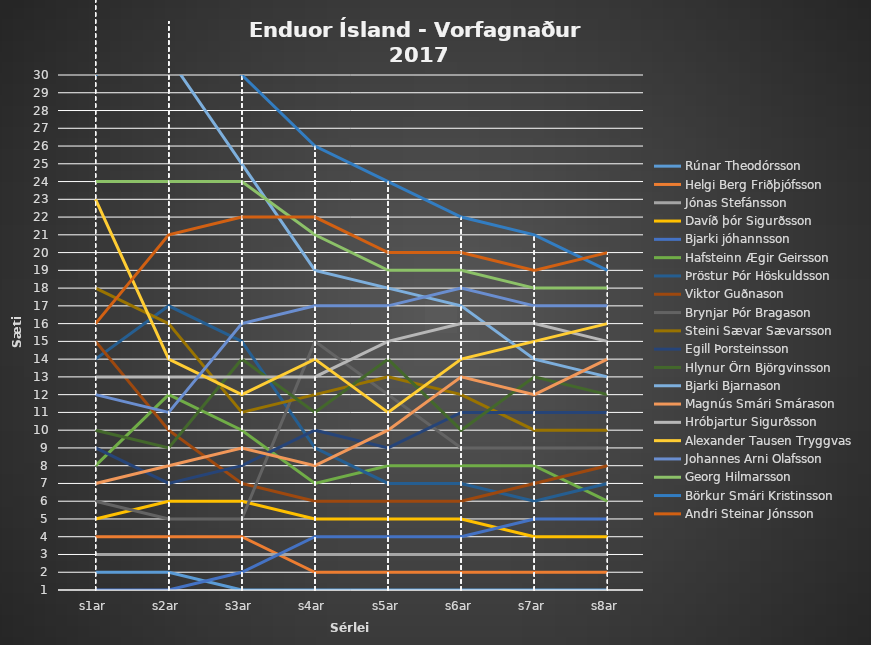
| Category | Rúnar Theodórsson | Helgi Berg Friðþjófsson | Jónas Stefánsson | Davíð þór Sigurðsson | Bjarki jóhannsson | Hafsteinn Ægir Geirsson | Þröstur Þór Höskuldsson | Viktor Guðnason | Brynjar Þór Bragason | Steini Sævar Sævarsson | Egill Þorsteinsson | Hlynur Örn Björgvinsson | Bjarki Bjarnason | Magnús Smári Smárason | Hróbjartur Sigurðsson | Alexander Tausen Tryggvas | Johannes Arni Olafsson | Georg Hilmarsson | Börkur Smári Kristinsson | Andri Steinar Jónsson |
|---|---|---|---|---|---|---|---|---|---|---|---|---|---|---|---|---|---|---|---|---|
| s1ar | 2 | 4 | 3 | 5 | 1 | 8 | 14 | 15 | 6 | 18 | 9 | 10 | 47 | 7 | 13 | 23 | 12 | 24 | 30 | 16 |
| s2ar | 2 | 4 | 3 | 6 | 1 | 12 | 17 | 10 | 5 | 16 | 7 | 9 | 31 | 8 | 13 | 14 | 11 | 24 | 33 | 21 |
| s3ar | 1 | 4 | 3 | 6 | 2 | 10 | 15 | 7 | 5 | 11 | 8 | 14 | 25 | 9 | 13 | 12 | 16 | 24 | 30 | 22 |
| s4ar | 1 | 2 | 3 | 5 | 4 | 7 | 9 | 6 | 15 | 12 | 10 | 11 | 19 | 8 | 13 | 14 | 17 | 21 | 26 | 22 |
| s5ar | 1 | 2 | 3 | 5 | 4 | 8 | 7 | 6 | 12 | 13 | 9 | 14 | 18 | 10 | 15 | 11 | 17 | 19 | 24 | 20 |
| s6ar | 1 | 2 | 3 | 5 | 4 | 8 | 7 | 6 | 9 | 12 | 11 | 10 | 17 | 13 | 16 | 14 | 18 | 19 | 22 | 20 |
| s7ar | 1 | 2 | 3 | 4 | 5 | 8 | 6 | 7 | 9 | 10 | 11 | 13 | 14 | 12 | 16 | 15 | 17 | 18 | 21 | 19 |
| s8ar | 1 | 2 | 3 | 4 | 5 | 6 | 7 | 8 | 9 | 10 | 11 | 12 | 13 | 14 | 15 | 16 | 17 | 18 | 19 | 20 |